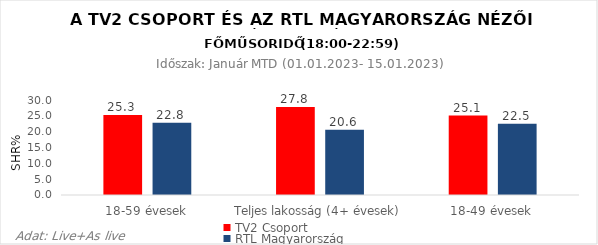
| Category | TV2 Csoport | RTL Magyarország |
|---|---|---|
| 18-59 évesek | 25.3 | 22.8 |
| Teljes lakosság (4+ évesek) | 27.8 | 20.6 |
| 18-49 évesek | 25.1 | 22.5 |